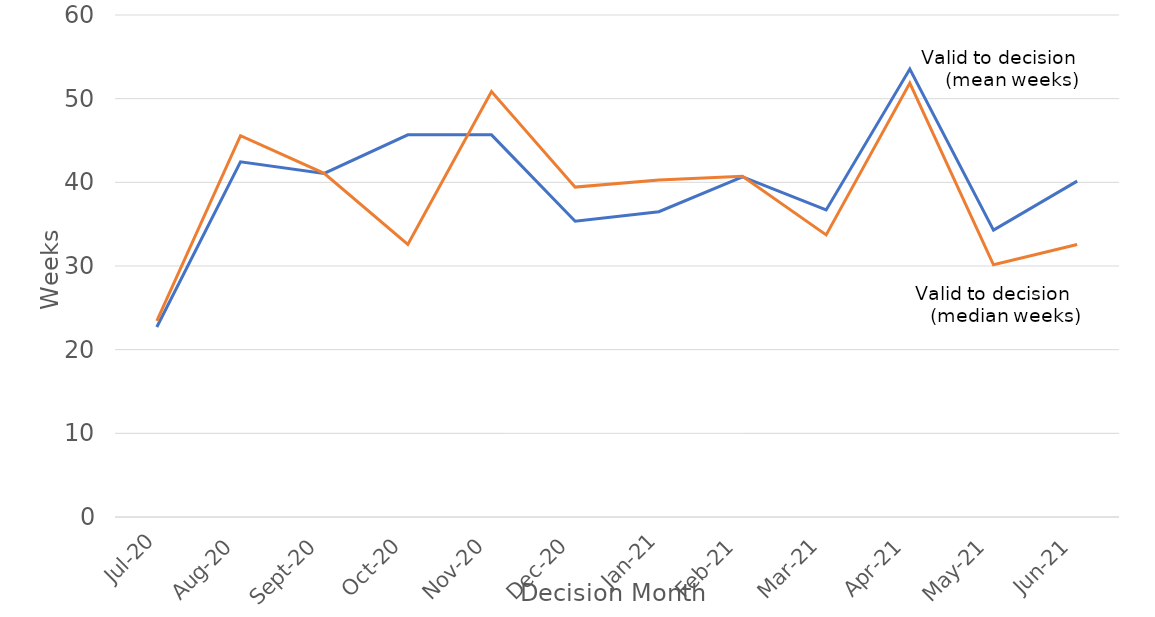
| Category | Valid to Decision (mean weeks) | Valid to Decision (median weeks) |
|---|---|---|
| 2020-07-01 | 22.714 | 23.429 |
| 2020-08-01 | 42.457 | 45.571 |
| 2020-09-01 | 41.071 | 41.071 |
| 2020-10-01 | 45.673 | 32.571 |
| 2020-11-01 | 45.673 | 50.857 |
| 2020-12-01 | 35.349 | 39.429 |
| 2021-01-01 | 36.495 | 40.286 |
| 2021-02-01 | 40.661 | 40.714 |
| 2021-03-01 | 36.705 | 33.714 |
| 2021-04-01 | 53.538 | 51.857 |
| 2021-05-01 | 34.286 | 30.143 |
| 2021-06-01 | 40.147 | 32.571 |